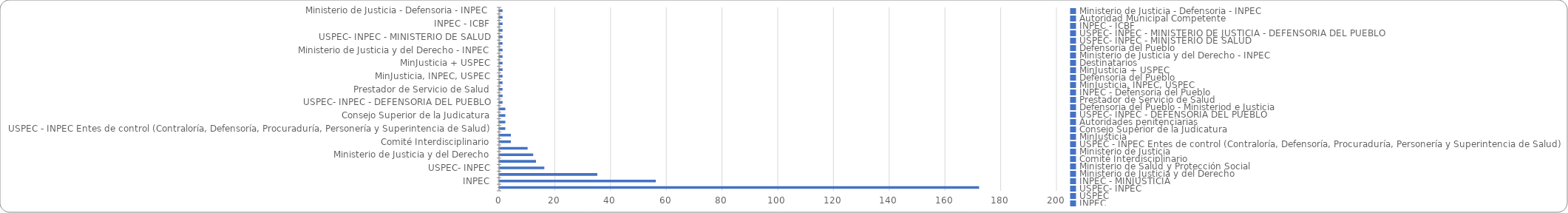
| Category | Recuento distinto de TAREA |
|---|---|
| Ministerio de Justicia - Defensoria - INPEC | 1 |
| Autoridad Municipal Competente | 1 |
| INPEC - ICBF | 1 |
| USPEC- INPEC - MINISTERIO DE JUSTICIA - DEFENSORIA DEL PUEBLO | 1 |
| USPEC- INPEC - MINISTERIO DE SALUD | 1 |
| Defensoría del Pueblo | 1 |
| Ministerio de Justicia y del Derecho - INPEC | 1 |
| Destinatarios | 1 |
| MinJusticia + USPEC | 1 |
| Defensoria del Pueblo | 1 |
| MinJusticia, INPEC, USPEC | 1 |
| INPEC - Defensoria del Pueblo | 1 |
| Prestador de Servicio de Salud | 1 |
| Defensoria del Pueblo - Ministeriod e Justicia | 1 |
| USPEC- INPEC - DEFENSORIA DEL PUEBLO | 1 |
| Autoridades penitenciarias | 2 |
| Consejo Superior de la Judicatura | 2 |
| MinJusticia | 2 |
| USPEC - INPEC Entes de control (Contraloría, Defensoría, Procuraduría, Personería y Superintencia de Salud) | 2 |
| Ministerio de Justicia | 4 |
| Comité Interdisciplinario | 4 |
| Ministerio de Salud y Protección Social | 10 |
| Ministerio de Justicia y del Derecho | 12 |
| INPEC - MINJUSTICIA | 13 |
| USPEC- INPEC | 16 |
| USPEC | 35 |
| INPEC | 56 |
| Total general | 172 |